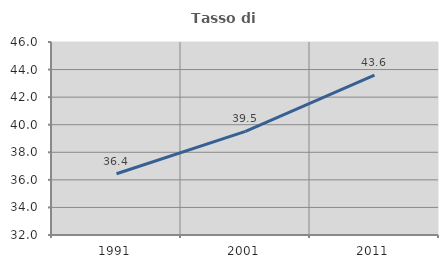
| Category | Tasso di occupazione   |
|---|---|
| 1991.0 | 36.442 |
| 2001.0 | 39.518 |
| 2011.0 | 43.597 |